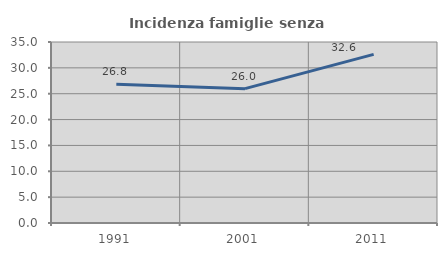
| Category | Incidenza famiglie senza nuclei |
|---|---|
| 1991.0 | 26.814 |
| 2001.0 | 25.978 |
| 2011.0 | 32.61 |